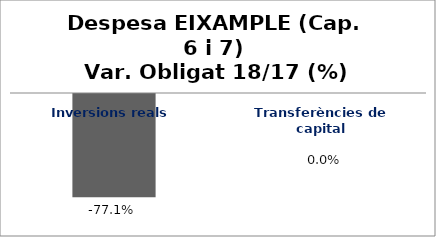
| Category | Series 0 |
|---|---|
| Inversions reals | -0.771 |
| Transferències de capital | 0 |